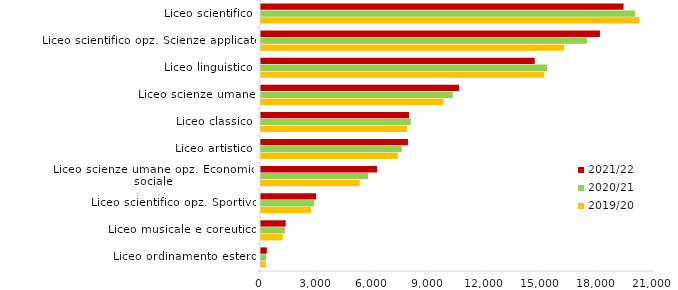
| Category | 2019/20 | 2020/21 | 2021/22 |
|---|---|---|---|
| Liceo ordinamento estero | 268 | 281 | 310 |
| Liceo musicale e coreutico | 1160 | 1280 | 1318 |
| Liceo scientifico opz. Sportivo | 2683 | 2839 | 2948 |
| Liceo scienze umane opz. Economico sociale | 5277 | 5729 | 6207 |
| Liceo artistico | 7316 | 7522 | 7852 |
| Liceo classico | 7815 | 8005 | 7915 |
| Liceo scienze umane | 9756 | 10249 | 10583 |
| Liceo linguistico | 15143 | 15292 | 14626 |
| Liceo scientifico opz. Scienze applicate | 16204 | 17430 | 18111 |
| Liceo scientifico | 20228 | 19987 | 19375 |